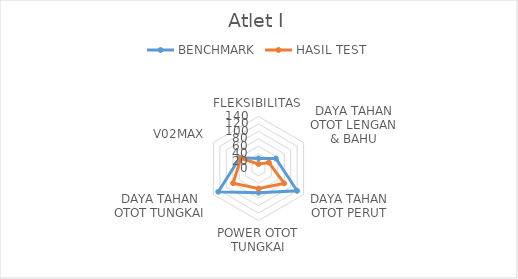
| Category | BENCHMARK | HASIL TEST |
|---|---|---|
| 0 | 27 | 12 |
| 1 | 54 | 32 |
| 2 | 120 | 80 |
| 3 | 65 | 54 |
| 4 | 125 | 79 |
| 5 | 58 | 54.7 |